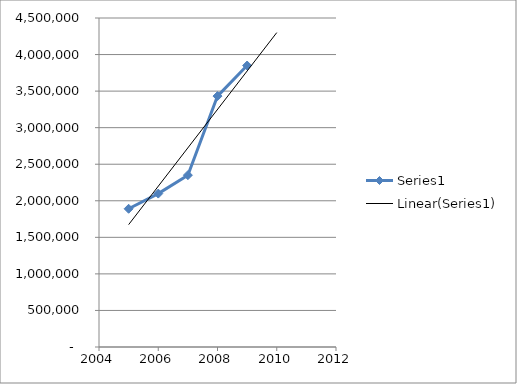
| Category | Series 0 |
|---|---|
| 2005.0 | 1890532 |
| 2006.0 | 2098490 |
| 2007.0 | 2350308 |
| 2008.0 | 3432000 |
| 2009.0 | 3850000 |